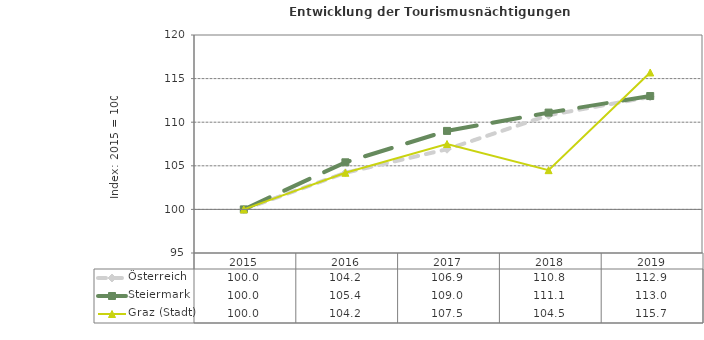
| Category | Österreich | Steiermark | Graz (Stadt) |
|---|---|---|---|
| 2019.0 | 112.9 | 113 | 115.7 |
| 2018.0 | 110.8 | 111.1 | 104.5 |
| 2017.0 | 106.9 | 109 | 107.5 |
| 2016.0 | 104.2 | 105.4 | 104.2 |
| 2015.0 | 100 | 100 | 100 |